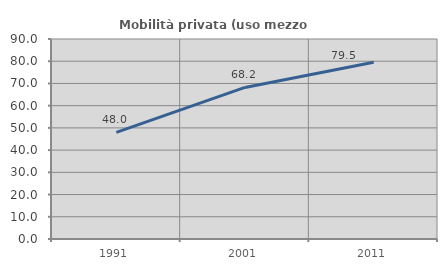
| Category | Mobilità privata (uso mezzo privato) |
|---|---|
| 1991.0 | 47.968 |
| 2001.0 | 68.2 |
| 2011.0 | 79.505 |